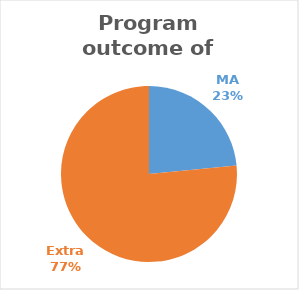
| Category | Series 0 |
|---|---|
| MA | 19 |
| Extra | 62 |